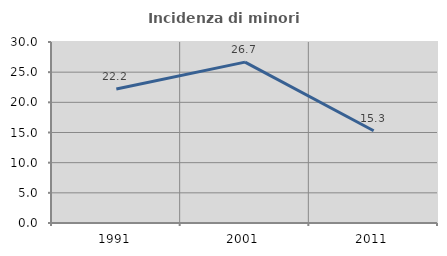
| Category | Incidenza di minori stranieri |
|---|---|
| 1991.0 | 22.222 |
| 2001.0 | 26.667 |
| 2011.0 | 15.294 |